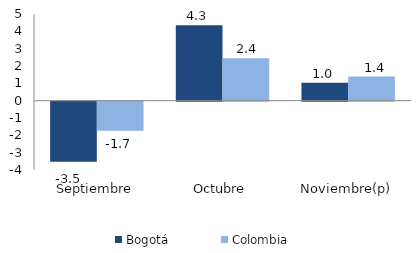
| Category | Bogotá | Colombia |
|---|---|---|
| Septiembre | -3.471 | -1.672 |
| Octubre | 4.35 | 2.444 |
| Noviembre(p) | 1.034 | 1.392 |